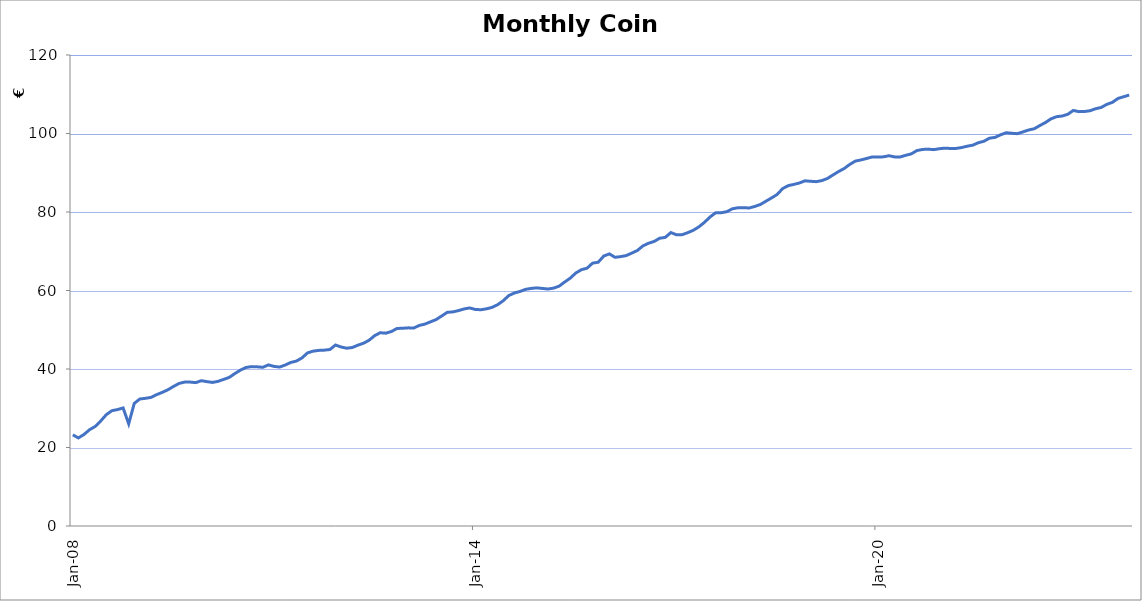
| Category | Series 0 |
|---|---|
| 2008-01-01 | 23225535.9 |
| 2008-02-01 | 22440671.96 |
| 2008-03-01 | 23317140.57 |
| 2008-04-01 | 24532761.75 |
| 2008-05-01 | 25355724.5 |
| 2008-06-01 | 26763361.89 |
| 2008-07-01 | 28369323.4 |
| 2008-08-01 | 29379543.42 |
| 2008-09-01 | 29660069.19 |
| 2008-10-01 | 30073646.49 |
| 2008-11-01 | 26038309.2 |
| 2008-12-01 | 31244081.35 |
| 2009-01-01 | 32367935.81 |
| 2009-02-01 | 32528956.67 |
| 2009-03-01 | 32761818.28 |
| 2009-04-01 | 33466552.97 |
| 2009-05-01 | 34039449.79 |
| 2009-06-01 | 34692419.63 |
| 2009-07-01 | 35539632.69 |
| 2009-08-01 | 36314560.61 |
| 2009-09-01 | 36663618.48 |
| 2009-10-01 | 36663455.62 |
| 2009-11-01 | 36529483.19 |
| 2009-12-01 | 37023937.06 |
| 2010-01-01 | 36776180.87 |
| 2010-02-01 | 36579907.62 |
| 2010-03-01 | 36863449.26 |
| 2010-04-01 | 37352925.37 |
| 2010-05-01 | 37870981.09 |
| 2010-06-01 | 38840076.68 |
| 2010-07-01 | 39719645.11 |
| 2010-08-01 | 40396075.47 |
| 2010-09-01 | 40608812.84 |
| 2010-10-01 | 40556438.69 |
| 2010-11-01 | 40436549.3 |
| 2010-12-01 | 41043696.15 |
| 2011-01-01 | 40663096.8 |
| 2011-02-01 | 40494942.36 |
| 2011-03-01 | 41014582.73 |
| 2011-04-01 | 41665509.36 |
| 2011-05-01 | 42017398.9 |
| 2011-06-01 | 42826477.12 |
| 2011-07-01 | 44107356.98 |
| 2011-08-01 | 44551479.21 |
| 2011-09-01 | 44738283.51 |
| 2011-10-01 | 44805583.56 |
| 2011-11-01 | 44965946.07 |
| 2011-12-01 | 46113000.98 |
| 2012-01-01 | 45600326.22 |
| 2012-02-01 | 45296973.67 |
| 2012-03-01 | 45471770.42 |
| 2012-04-01 | 46068295.89 |
| 2012-05-01 | 46562302.2 |
| 2012-06-01 | 47318785.52 |
| 2012-07-01 | 48493119.44 |
| 2012-08-01 | 49238505.09 |
| 2012-09-01 | 49128743.08 |
| 2012-10-01 | 49545736.59 |
| 2012-11-01 | 50329038.76 |
| 2012-12-01 | 50374982.909 |
| 2013-01-01 | 50483855.109 |
| 2013-02-01 | 50436599.939 |
| 2013-03-01 | 51104580.549 |
| 2013-04-01 | 51442437.18 |
| 2013-05-01 | 52024074.419 |
| 2013-06-01 | 52589076.559 |
| 2013-07-01 | 53510092.179 |
| 2013-08-01 | 54440054.389 |
| 2013-09-01 | 54551455.57 |
| 2013-10-01 | 54878752.92 |
| 2013-11-01 | 55300601.069 |
| 2013-12-01 | 55555250.78 |
| 2014-01-01 | 55179392.809 |
| 2014-02-01 | 55094474.29 |
| 2014-03-01 | 55325747.66 |
| 2014-04-01 | 55694772.05 |
| 2014-05-01 | 56375604.29 |
| 2014-06-01 | 57383183.35 |
| 2014-07-01 | 58717632.79 |
| 2014-08-01 | 59363193.78 |
| 2014-09-01 | 59751034.61 |
| 2014-10-01 | 60285533.15 |
| 2014-11-01 | 60536330.71 |
| 2014-12-01 | 60673632.62 |
| 2015-01-01 | 60526597.13 |
| 2015-02-01 | 60380451.98 |
| 2015-03-01 | 60597209.76 |
| 2015-04-01 | 61102355.38 |
| 2015-05-01 | 62159266.18 |
| 2015-06-01 | 63150555.45 |
| 2015-07-01 | 64464187.61 |
| 2015-08-01 | 65303399.47 |
| 2015-09-01 | 65678050.45 |
| 2015-10-01 | 66977911.83 |
| 2015-11-01 | 67204041.55 |
| 2015-12-01 | 68786889.9 |
| 2016-01-01 | 69329690.91 |
| 2016-02-01 | 68458215.28 |
| 2016-03-01 | 68629050.11 |
| 2016-04-01 | 68896826.78 |
| 2016-05-01 | 69521401.34 |
| 2016-06-01 | 70186980.55 |
| 2016-07-01 | 71366190.61 |
| 2016-08-01 | 72038556.96 |
| 2016-09-01 | 72491283.17 |
| 2016-10-01 | 73314103.01 |
| 2016-11-01 | 73536919.64 |
| 2016-12-01 | 74761019.57 |
| 2017-01-01 | 74202877.82 |
| 2017-02-01 | 74207495.62 |
| 2017-03-01 | 74725223.52 |
| 2017-04-01 | 75333710.54 |
| 2017-05-01 | 76203148.42 |
| 2017-06-01 | 77346856.33 |
| 2017-07-01 | 78724338.28 |
| 2017-08-01 | 79797376.56 |
| 2017-09-01 | 79816585.03 |
| 2017-10-01 | 80073442.04 |
| 2017-11-01 | 80814363.88 |
| 2017-12-01 | 81081017.27 |
| 2018-01-01 | 81113717.23 |
| 2018-02-01 | 81015405.25 |
| 2018-03-01 | 81412378.52 |
| 2018-04-01 | 81903836.8 |
| 2018-05-01 | 82742457.46 |
| 2018-06-01 | 83574407.02 |
| 2018-07-01 | 84454251.47 |
| 2018-08-01 | 85965263.09 |
| 2018-09-01 | 86717264.07 |
| 2018-10-01 | 87031833.31 |
| 2018-11-01 | 87395340.38 |
| 2018-12-01 | 87943851.93 |
| 2019-01-01 | 87829158.46 |
| 2019-02-01 | 87728711.19 |
| 2019-03-01 | 87997368.59 |
| 2019-04-01 | 88534352.95 |
| 2019-05-01 | 89432228.74 |
| 2019-06-01 | 90307866.42 |
| 2019-07-01 | 91069930 |
| 2019-08-01 | 92119669.36 |
| 2019-09-01 | 92965447.75 |
| 2019-10-01 | 93262860.41 |
| 2019-11-01 | 93628241.44 |
| 2019-12-01 | 94021255.53 |
| 2020-01-01 | 93993984.88 |
| 2020-02-01 | 94049364.5 |
| 2020-03-01 | 94339146.01 |
| 2020-04-01 | 94045329.91 |
| 2020-05-01 | 94011616.67 |
| 2020-06-01 | 94439934.49 |
| 2020-07-01 | 94799411.9 |
| 2020-08-01 | 95644589.17 |
| 2020-09-01 | 95926579.31 |
| 2020-10-01 | 96022130.53 |
| 2020-11-01 | 95885439.21 |
| 2020-12-01 | 96115963.16 |
| 2021-01-01 | 96270555.63 |
| 2021-02-01 | 96186908.95 |
| 2021-03-01 | 96192081.61 |
| 2021-04-01 | 96413825.92 |
| 2021-05-01 | 96759686.2 |
| 2021-06-01 | 97022639.15 |
| 2021-07-01 | 97641349 |
| 2021-08-01 | 98021860.22 |
| 2021-09-01 | 98807700.04 |
| 2021-10-01 | 99009429.59 |
| 2021-11-01 | 99677853.56 |
| 2021-12-01 | 100197150.75 |
| 2022-01-01 | 100058432.8 |
| 2022-02-01 | 99953394.65 |
| 2022-03-01 | 100421805.91 |
| 2022-04-01 | 100895064.12 |
| 2022-05-01 | 101200016.33 |
| 2022-06-01 | 102024147.33 |
| 2022-07-01 | 102780810.49 |
| 2022-08-01 | 103730127.54 |
| 2022-09-01 | 104280930.79 |
| 2022-10-01 | 104452599.56 |
| 2022-11-01 | 104885839.24 |
| 2022-12-01 | 105872730.61 |
| 2023-01-01 | 105570944.32 |
| 2023-02-01 | 105607377.25 |
| 2023-03-01 | 105811042.22 |
| 2023-04-01 | 106314819.51 |
| 2023-05-01 | 106642470.07 |
| 2023-06-01 | 107427997.18 |
| 2023-07-01 | 107941744.05 |
| 2023-08-01 | 108937511.61 |
| 2023-09-01 | 109357462.85 |
| 2023-10-01 | 109801314.16 |